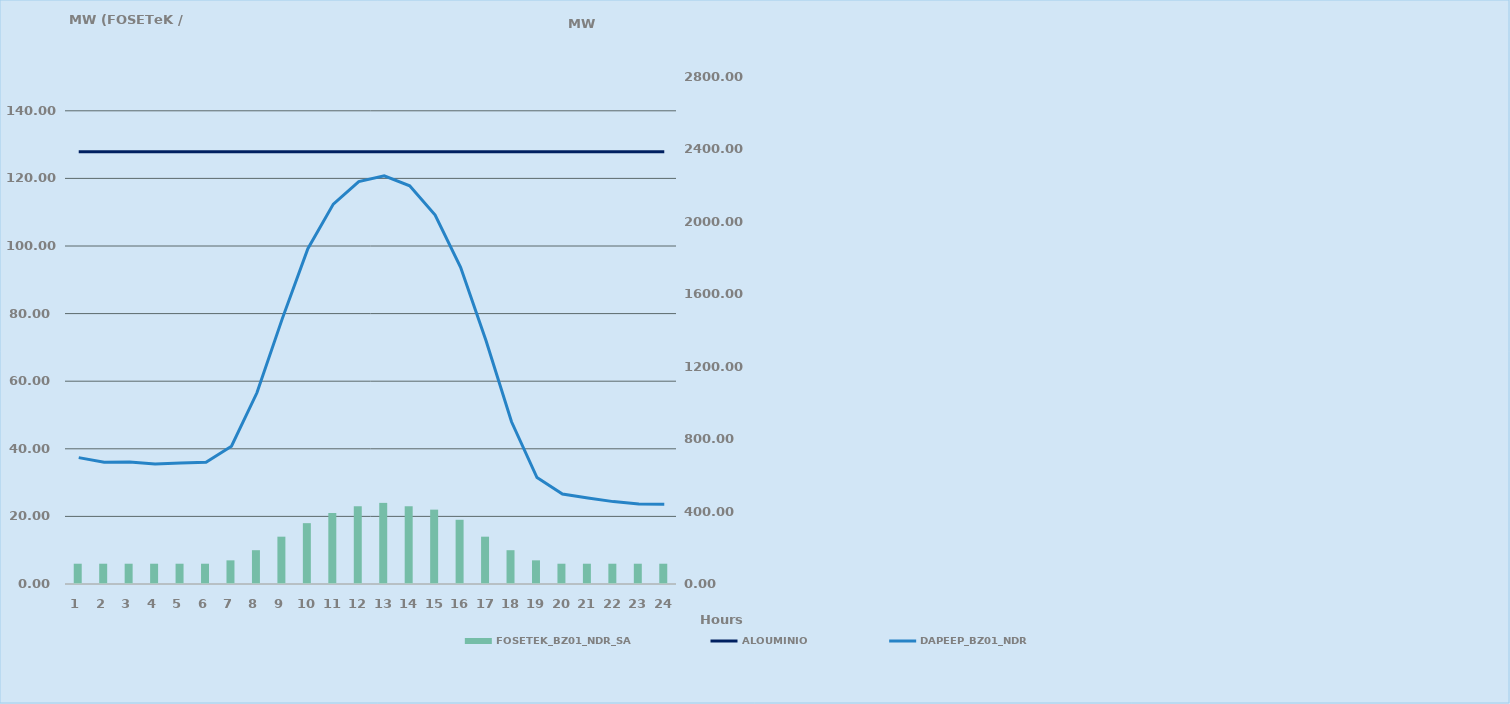
| Category | FOSETEK_BZ01_NDR_SA |
|---|---|
| 0 | 6 |
| 1 | 6 |
| 2 | 6 |
| 3 | 6 |
| 4 | 6 |
| 5 | 6 |
| 6 | 7 |
| 7 | 10 |
| 8 | 14 |
| 9 | 18 |
| 10 | 21 |
| 11 | 23 |
| 12 | 24 |
| 13 | 23 |
| 14 | 22 |
| 15 | 19 |
| 16 | 14 |
| 17 | 10 |
| 18 | 7 |
| 19 | 6 |
| 20 | 6 |
| 21 | 6 |
| 22 | 6 |
| 23 | 6 |